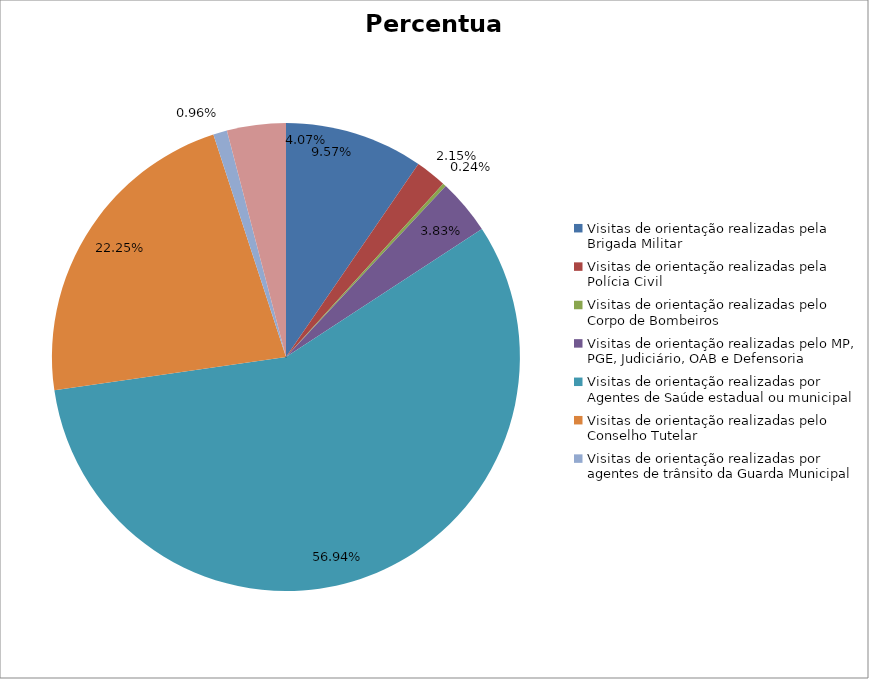
| Category | Percentual |
|---|---|
| Visitas de orientação realizadas pela Brigada Militar | 0.096 |
| Visitas de orientação realizadas pela Polícia Civil | 0.022 |
| Visitas de orientação realizadas pelo Corpo de Bombeiros | 0.002 |
| Visitas de orientação realizadas pelo MP, PGE, Judiciário, OAB e Defensoria | 0.038 |
| Visitas de orientação realizadas por Agentes de Saúde estadual ou municipal | 0.569 |
| Visitas de orientação realizadas pelo Conselho Tutelar | 0.222 |
| Visitas de orientação realizadas por agentes de trânsito da Guarda Municipal | 0.01 |
| Visitas de orientação realizadas por ONGs, entidades privadas, CRAS e CREAS | 0.041 |